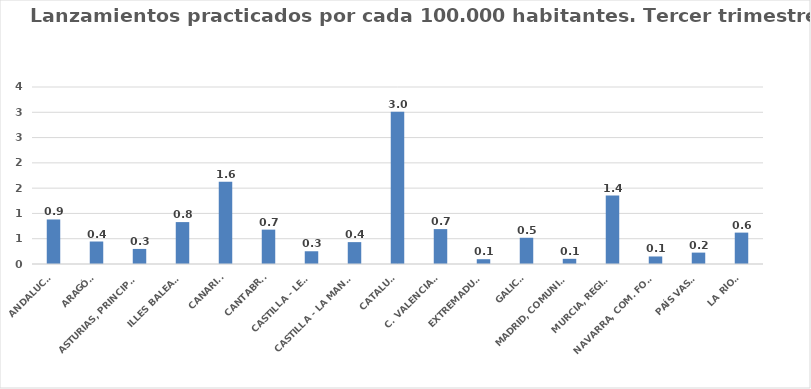
| Category | Series 0 |
|---|---|
| ANDALUCÍA | 0.88 |
| ARAGÓN | 0.445 |
| ASTURIAS, PRINCIPADO | 0.298 |
| ILLES BALEARS | 0.829 |
| CANARIAS | 1.627 |
| CANTABRIA | 0.68 |
| CASTILLA - LEÓN | 0.252 |
| CASTILLA - LA MANCHA | 0.433 |
| CATALUÑA | 3.013 |
| C. VALENCIANA | 0.69 |
| EXTREMADURA | 0.095 |
| GALICIA | 0.519 |
| MADRID, COMUNIDAD | 0.102 |
| MURCIA, REGIÓN | 1.352 |
| NAVARRA, COM. FORAL | 0.149 |
| PAÍS VASCO | 0.225 |
| LA RIOJA | 0.621 |